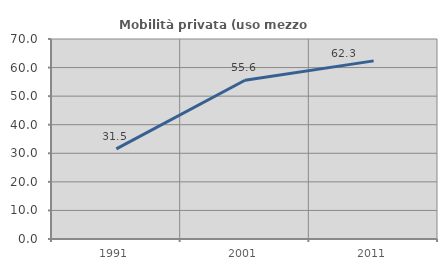
| Category | Mobilità privata (uso mezzo privato) |
|---|---|
| 1991.0 | 31.548 |
| 2001.0 | 55.556 |
| 2011.0 | 62.346 |